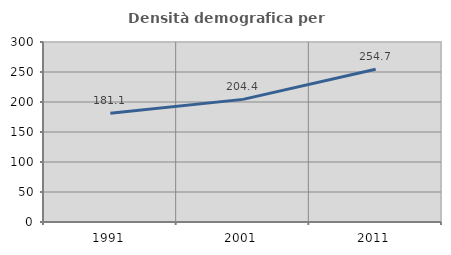
| Category | Densità demografica |
|---|---|
| 1991.0 | 181.12 |
| 2001.0 | 204.373 |
| 2011.0 | 254.72 |